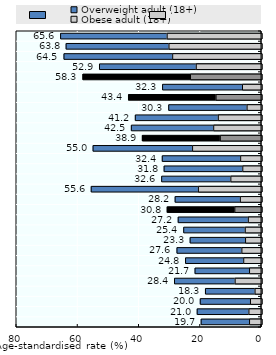
| Category | Overweight adult (18+) | Obese adult (18+) |
|---|---|---|
| New Zealand | 65.6 | 30.8 |
| Fiji | 63.8 | 30.2 |
| Australia | 64.5 | 29 |
| Papua New Guinea | 52.9 | 21.3 |
| OECD | 58.314 | 23.181 |
| China | 32.3 | 6.2 |
| Asia Pacific-H | 43.433 | 14.833 |
| Korea, Rep. | 30.3 | 4.7 |
| Brunei Darussalam | 41.2 | 14.1 |
| Malaysia | 42.5 | 15.6 |
| Asia Pacific-UM | 38.9 | 13.44 |
| Solomon Islands | 55 | 22.5 |
| Korea, DPR | 32.4 | 6.8 |
| Singapore | 31.8 | 6.1 |
| Thailand | 32.6 | 10 |
| Mongolia | 55.6 | 20.6 |
| Indonesia | 28.2 | 6.9 |
| Asia Pacific-LM/L | 30.786 | 8.7 |
| Japan | 27.2 | 4.3 |
| Lao, PDR | 25.4 | 5.3 |
| Sri Lanka | 23.3 | 5.2 |
| Philippines | 27.6 | 6.4 |
| Myanmar | 24.8 | 5.8 |
| Cambodia | 21.7 | 3.9 |
| Pakistan | 28.4 | 8.6 |
| Viet Nam | 18.3 | 2.1 |
| Bangladesh | 20 | 3.6 |
| Nepal | 21 | 4.1 |
| India | 19.7 | 3.9 |